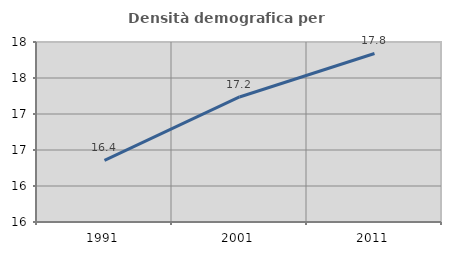
| Category | Densità demografica |
|---|---|
| 1991.0 | 16.355 |
| 2001.0 | 17.237 |
| 2011.0 | 17.841 |